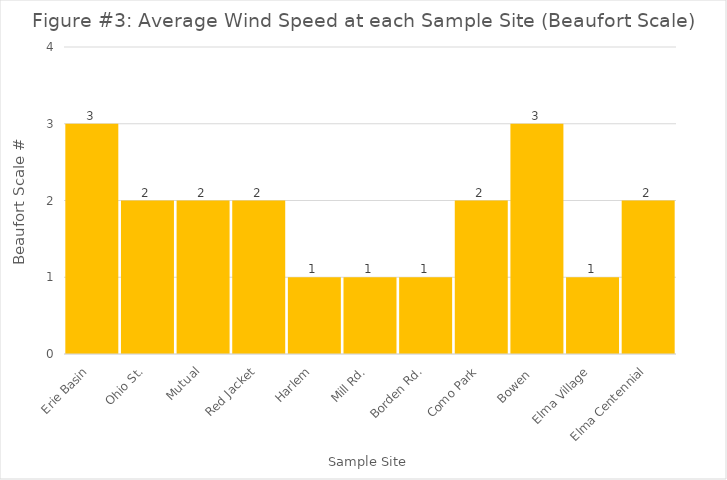
| Category | Series 0 |
|---|---|
| Erie Basin | 3 |
| Ohio St. | 2 |
| Mutual | 2 |
| Red Jacket | 2 |
| Harlem | 1 |
| Mill Rd. | 1 |
| Borden Rd. | 1 |
| Como Park | 2 |
| Bowen  | 3 |
| Elma Village | 1 |
| Elma Centennial | 2 |